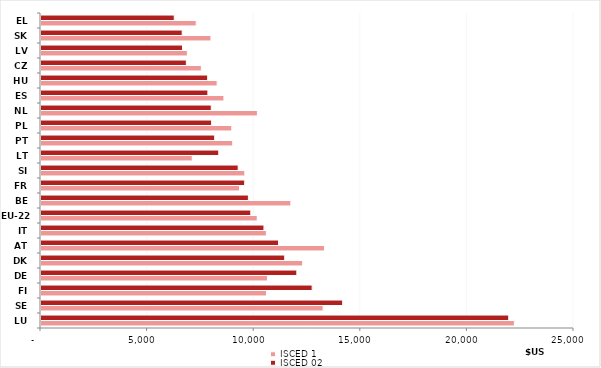
| Category | ISCED 1 | ISCED 02 |
|---|---|---|
| LU | 22203.32 | 21938.25 |
| SE | 13233.52 | 14149.75 |
| FI | 10575.51 | 12717.88 |
| DE | 10621.85 | 11999.67 |
| DK | 12273.18 | 11431.36 |
| AT | 13298.9 | 11142.79 |
| IT | 10569.57 | 10457.57 |
| EU-22 | 10141.153 | 9840.852 |
| BE | 11719.9 | 9727.958 |
| FR | 9311.521 | 9554.688 |
| SI | 9562.113 | 9249.402 |
| LT | 7095.386 | 8338.627 |
| PT | 8991.832 | 8147.375 |
| PL | 8948.665 | 8003.067 |
| NL | 10149.94 | 7985.496 |
| ES | 8580.329 | 7827.382 |
| HU | 8262.191 | 7817.993 |
| CZ | 7520.278 | 6817.86 |
| LV | 6865.037 | 6637.015 |
| SK | 7972.15 | 6623.21 |
| EL | 7279.261 | 6249.703 |